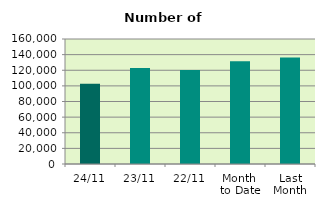
| Category | Series 0 |
|---|---|
| 24/11 | 102626 |
| 23/11 | 122994 |
| 22/11 | 120228 |
| Month 
to Date | 131369.333 |
| Last
Month | 136171.238 |